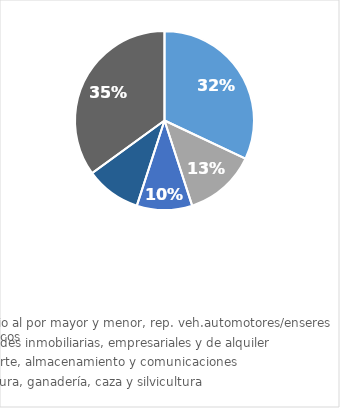
| Category | Series 0 |
|---|---|
| Comercio al por mayor y menor, rep. veh.automotores/enseres domésticos | 0.32 |
| Actividades inmobiliarias, empresariales y de alquiler | 0.13 |
| Transporte, almacenamiento y comunicaciones | 0.1 |
| Agricultura, ganadería, caza y silvicultura | 0.1 |
| Otros Rubros | 0.35 |